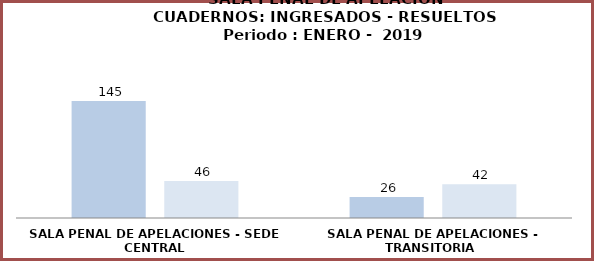
| Category | Series 0 | Series 1 |
|---|---|---|
| SALA PENAL DE APELACIONES - SEDE CENTRAL | 145 | 46 |
| SALA PENAL DE APELACIONES - TRANSITORIA  | 26 | 42 |